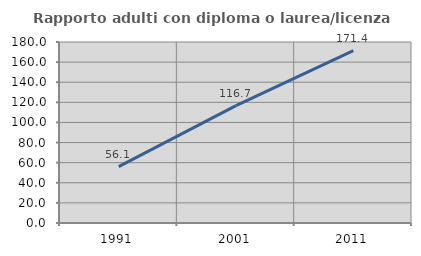
| Category | Rapporto adulti con diploma o laurea/licenza media  |
|---|---|
| 1991.0 | 56.061 |
| 2001.0 | 116.667 |
| 2011.0 | 171.429 |